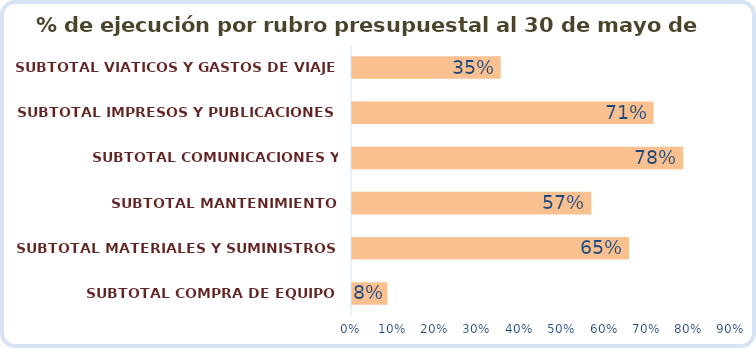
| Category | % de ejecución por rubro presupuestal al 30 de mayo de 2016 |
|---|---|
| SUBTOTAL COMPRA DE EQUIPO | 0.083 |
| SUBTOTAL MATERIALES Y SUMINISTROS | 0.654 |
| SUBTOTAL MANTENIMIENTO | 0.565 |
| SUBTOTAL COMUNICACIONES Y TRANSPORTE | 0.782 |
| SUBTOTAL IMPRESOS Y PUBLICACIONES | 0.712 |
| SUBTOTAL VIATICOS Y GASTOS DE VIAJE | 0.351 |